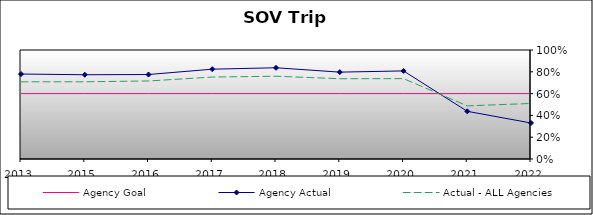
| Category | Agency Goal | Agency Actual | Actual - ALL Agencies |
|---|---|---|---|
| 2013.0 | 0.6 | 0.78 | 0.708 |
| 2015.0 | 0.6 | 0.773 | 0.708 |
| 2016.0 | 0.6 | 0.775 | 0.716 |
| 2017.0 | 0.6 | 0.824 | 0.752 |
| 2018.0 | 0.6 | 0.837 | 0.759 |
| 2019.0 | 0.6 | 0.797 | 0.736 |
| 2020.0 | 0.6 | 0.808 | 0.737 |
| 2021.0 | 0.6 | 0.438 | 0.487 |
| 2022.0 | 0.6 | 0.33 | 0.509 |